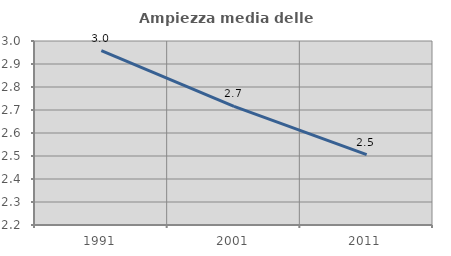
| Category | Ampiezza media delle famiglie |
|---|---|
| 1991.0 | 2.958 |
| 2001.0 | 2.716 |
| 2011.0 | 2.506 |